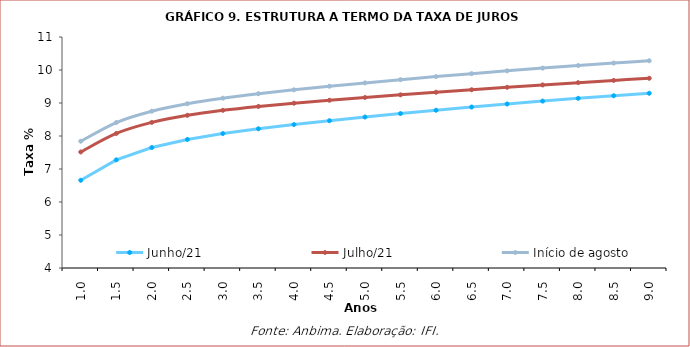
| Category | Junho/21 | Julho/21 | Início de agosto |
|---|---|---|---|
| 1.0 | 6.658 | 7.516 | 7.842 |
| 1.5 | 7.277 | 8.078 | 8.409 |
| 2.0 | 7.65 | 8.412 | 8.751 |
| 2.5 | 7.895 | 8.627 | 8.978 |
| 3.0 | 8.074 | 8.778 | 9.146 |
| 3.5 | 8.219 | 8.895 | 9.281 |
| 4.0 | 8.347 | 8.994 | 9.4 |
| 4.5 | 8.464 | 9.083 | 9.508 |
| 5.0 | 8.574 | 9.167 | 9.61 |
| 5.5 | 8.68 | 9.247 | 9.707 |
| 6.0 | 8.781 | 9.325 | 9.8 |
| 6.5 | 8.878 | 9.401 | 9.889 |
| 7.0 | 8.97 | 9.475 | 9.975 |
| 7.5 | 9.058 | 9.547 | 10.057 |
| 8.0 | 9.141 | 9.617 | 10.135 |
| 8.5 | 9.22 | 9.685 | 10.21 |
| 9.0 | 9.295 | 9.75 | 10.28 |